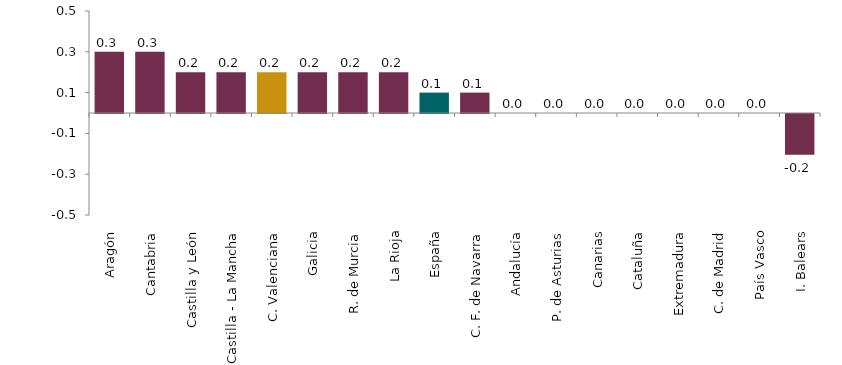
| Category | Series 0 |
|---|---|
| Aragón | 0.3 |
| Cantabria | 0.3 |
| Castilla y León | 0.2 |
| Castilla - La Mancha | 0.2 |
| C. Valenciana | 0.2 |
| Galicia | 0.2 |
| R. de Murcia | 0.2 |
| La Rioja | 0.2 |
| España | 0.1 |
| C. F. de Navarra | 0.1 |
| Andalucía | 0 |
| P. de Asturias | 0 |
| Canarias | 0 |
| Cataluña | 0 |
| Extremadura | 0 |
| C. de Madrid | 0 |
| País Vasco | 0 |
| I. Balears | -0.2 |